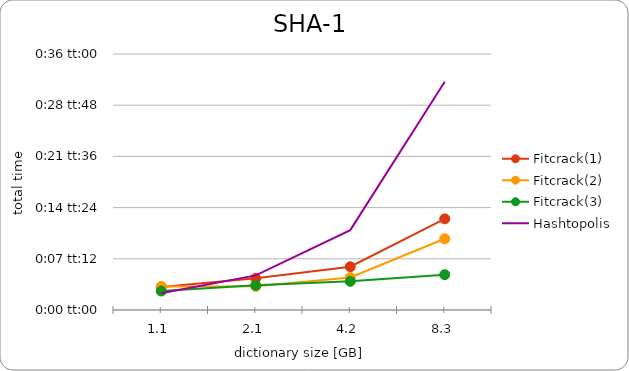
| Category | Fitcrack(1) | Fitcrack(2) | Fitcrack(3) | Hashtopolis |
|---|---|---|---|---|
| 1.1 | 0.002 | 0.002 | 0.002 | 0.002 |
| 2.1 | 0.003 | 0.002 | 0.002 | 0.003 |
| 4.2 | 0.004 | 0.003 | 0.003 | 0.008 |
| 8.3 | 0.009 | 0.007 | 0.003 | 0.022 |